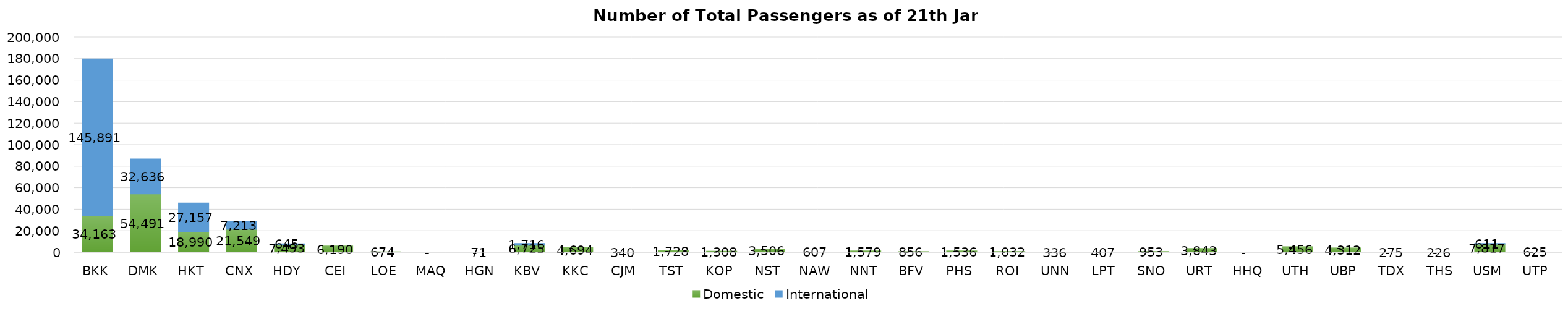
| Category | Domestic | International |
|---|---|---|
| BKK | 34163 | 145891 |
| DMK | 54491 | 32636 |
| HKT | 18990 | 27157 |
| CNX | 21549 | 7213 |
| HDY | 7493 | 645 |
| CEI | 6190 | 0 |
| LOE | 674 | 0 |
| MAQ | 0 | 0 |
| HGN | 71 | 0 |
| KBV | 6725 | 1716 |
| KKC | 4694 | 0 |
| CJM | 340 | 0 |
| TST | 1728 | 0 |
| KOP | 1308 | 0 |
| NST | 3506 | 0 |
| NAW | 607 | 0 |
| NNT | 1579 | 0 |
| BFV | 856 | 0 |
| PHS | 1536 | 0 |
| ROI | 1032 | 0 |
| UNN | 336 | 0 |
| LPT | 407 | 0 |
| SNO | 953 | 0 |
| URT | 3843 | 0 |
| HHQ | 0 | 0 |
| UTH | 5456 | 0 |
| UBP | 4312 | 0 |
| TDX | 275 | 0 |
| THS | 226 | 0 |
| USM | 7817 | 611 |
| UTP | 625 | 0 |